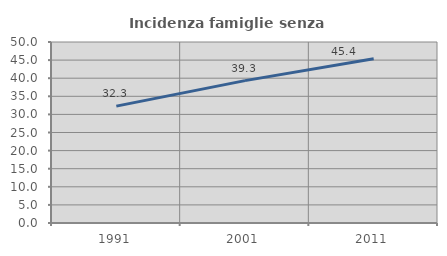
| Category | Incidenza famiglie senza nuclei |
|---|---|
| 1991.0 | 32.285 |
| 2001.0 | 39.328 |
| 2011.0 | 45.369 |